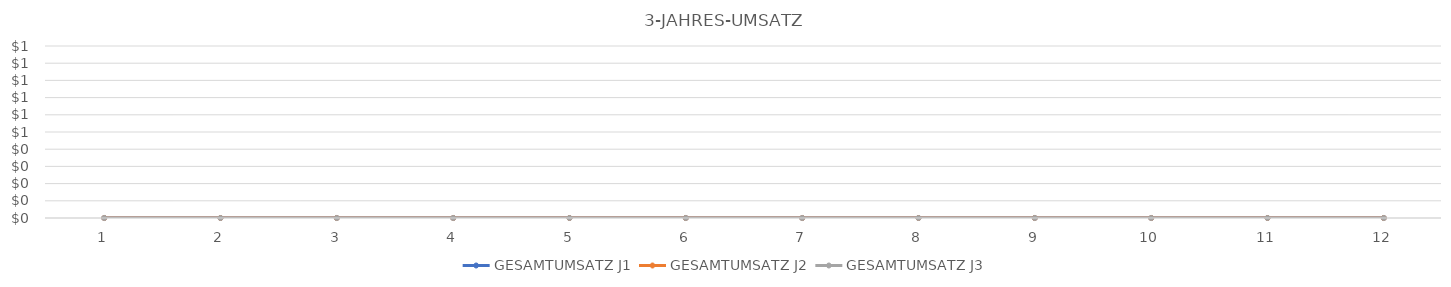
| Category | GESAMTUMSATZ J1 | GESAMTUMSATZ J2 | GESAMTUMSATZ J3 |
|---|---|---|---|
| 0 | 0 | 0 | 0 |
| 1 | 0 | 0 | 0 |
| 2 | 0 | 0 | 0 |
| 3 | 0 | 0 | 0 |
| 4 | 0 | 0 | 0 |
| 5 | 0 | 0 | 0 |
| 6 | 0 | 0 | 0 |
| 7 | 0 | 0 | 0 |
| 8 | 0 | 0 | 0 |
| 9 | 0 | 0 | 0 |
| 10 | 0 | 0 | 0 |
| 11 | 0 | 0 | 0 |